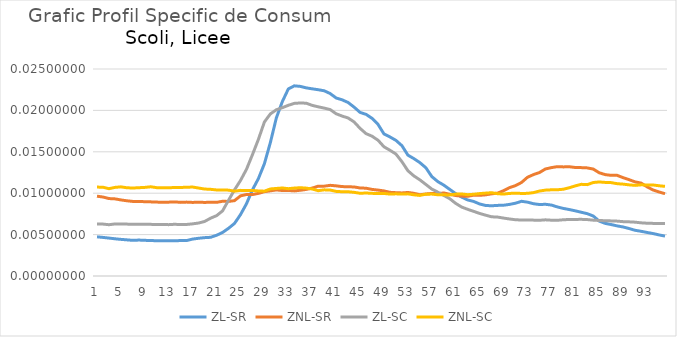
| Category | ZL-SR | ZNL-SR | ZL-SC | ZNL-SC |
|---|---|---|---|---|
| 0 | 0.005 | 0.01 | 0.006 | 0.011 |
| 1 | 0.005 | 0.01 | 0.006 | 0.011 |
| 2 | 0.005 | 0.009 | 0.006 | 0.011 |
| 3 | 0.004 | 0.009 | 0.006 | 0.011 |
| 4 | 0.004 | 0.009 | 0.006 | 0.011 |
| 5 | 0.004 | 0.009 | 0.006 | 0.011 |
| 6 | 0.004 | 0.009 | 0.006 | 0.011 |
| 7 | 0.004 | 0.009 | 0.006 | 0.011 |
| 8 | 0.004 | 0.009 | 0.006 | 0.011 |
| 9 | 0.004 | 0.009 | 0.006 | 0.011 |
| 10 | 0.004 | 0.009 | 0.006 | 0.011 |
| 11 | 0.004 | 0.009 | 0.006 | 0.011 |
| 12 | 0.004 | 0.009 | 0.006 | 0.011 |
| 13 | 0.004 | 0.009 | 0.006 | 0.011 |
| 14 | 0.004 | 0.009 | 0.006 | 0.011 |
| 15 | 0.004 | 0.009 | 0.006 | 0.011 |
| 16 | 0.004 | 0.009 | 0.006 | 0.011 |
| 17 | 0.005 | 0.009 | 0.006 | 0.011 |
| 18 | 0.005 | 0.009 | 0.007 | 0.011 |
| 19 | 0.005 | 0.009 | 0.007 | 0.01 |
| 20 | 0.005 | 0.009 | 0.007 | 0.01 |
| 21 | 0.005 | 0.009 | 0.008 | 0.01 |
| 22 | 0.006 | 0.009 | 0.009 | 0.01 |
| 23 | 0.006 | 0.009 | 0.01 | 0.01 |
| 24 | 0.007 | 0.01 | 0.012 | 0.01 |
| 25 | 0.009 | 0.01 | 0.013 | 0.01 |
| 26 | 0.01 | 0.01 | 0.015 | 0.01 |
| 27 | 0.012 | 0.01 | 0.017 | 0.01 |
| 28 | 0.014 | 0.01 | 0.019 | 0.01 |
| 29 | 0.016 | 0.01 | 0.02 | 0.011 |
| 30 | 0.019 | 0.01 | 0.02 | 0.011 |
| 31 | 0.021 | 0.01 | 0.02 | 0.011 |
| 32 | 0.023 | 0.01 | 0.021 | 0.011 |
| 33 | 0.023 | 0.01 | 0.021 | 0.011 |
| 34 | 0.023 | 0.01 | 0.021 | 0.011 |
| 35 | 0.023 | 0.01 | 0.021 | 0.011 |
| 36 | 0.023 | 0.011 | 0.021 | 0.011 |
| 37 | 0.022 | 0.011 | 0.02 | 0.01 |
| 38 | 0.022 | 0.011 | 0.02 | 0.01 |
| 39 | 0.022 | 0.011 | 0.02 | 0.01 |
| 40 | 0.021 | 0.011 | 0.02 | 0.01 |
| 41 | 0.021 | 0.011 | 0.019 | 0.01 |
| 42 | 0.021 | 0.011 | 0.019 | 0.01 |
| 43 | 0.02 | 0.011 | 0.019 | 0.01 |
| 44 | 0.02 | 0.011 | 0.018 | 0.01 |
| 45 | 0.02 | 0.011 | 0.017 | 0.01 |
| 46 | 0.019 | 0.01 | 0.017 | 0.01 |
| 47 | 0.018 | 0.01 | 0.016 | 0.01 |
| 48 | 0.017 | 0.01 | 0.016 | 0.01 |
| 49 | 0.017 | 0.01 | 0.015 | 0.01 |
| 50 | 0.016 | 0.01 | 0.015 | 0.01 |
| 51 | 0.016 | 0.01 | 0.014 | 0.01 |
| 52 | 0.015 | 0.01 | 0.013 | 0.01 |
| 53 | 0.014 | 0.01 | 0.012 | 0.01 |
| 54 | 0.014 | 0.01 | 0.012 | 0.01 |
| 55 | 0.013 | 0.01 | 0.011 | 0.01 |
| 56 | 0.012 | 0.01 | 0.01 | 0.01 |
| 57 | 0.011 | 0.01 | 0.01 | 0.01 |
| 58 | 0.011 | 0.01 | 0.01 | 0.01 |
| 59 | 0.01 | 0.01 | 0.009 | 0.01 |
| 60 | 0.01 | 0.01 | 0.009 | 0.01 |
| 61 | 0.01 | 0.01 | 0.008 | 0.01 |
| 62 | 0.009 | 0.01 | 0.008 | 0.01 |
| 63 | 0.009 | 0.01 | 0.008 | 0.01 |
| 64 | 0.009 | 0.01 | 0.008 | 0.01 |
| 65 | 0.009 | 0.01 | 0.007 | 0.01 |
| 66 | 0.008 | 0.01 | 0.007 | 0.01 |
| 67 | 0.009 | 0.01 | 0.007 | 0.01 |
| 68 | 0.009 | 0.01 | 0.007 | 0.01 |
| 69 | 0.009 | 0.011 | 0.007 | 0.01 |
| 70 | 0.009 | 0.011 | 0.007 | 0.01 |
| 71 | 0.009 | 0.011 | 0.007 | 0.01 |
| 72 | 0.009 | 0.012 | 0.007 | 0.01 |
| 73 | 0.009 | 0.012 | 0.007 | 0.01 |
| 74 | 0.009 | 0.012 | 0.007 | 0.01 |
| 75 | 0.009 | 0.013 | 0.007 | 0.01 |
| 76 | 0.009 | 0.013 | 0.007 | 0.01 |
| 77 | 0.008 | 0.013 | 0.007 | 0.01 |
| 78 | 0.008 | 0.013 | 0.007 | 0.01 |
| 79 | 0.008 | 0.013 | 0.007 | 0.011 |
| 80 | 0.008 | 0.013 | 0.007 | 0.011 |
| 81 | 0.008 | 0.013 | 0.007 | 0.011 |
| 82 | 0.008 | 0.013 | 0.007 | 0.011 |
| 83 | 0.007 | 0.013 | 0.007 | 0.011 |
| 84 | 0.007 | 0.012 | 0.007 | 0.011 |
| 85 | 0.006 | 0.012 | 0.007 | 0.011 |
| 86 | 0.006 | 0.012 | 0.007 | 0.011 |
| 87 | 0.006 | 0.012 | 0.007 | 0.011 |
| 88 | 0.006 | 0.012 | 0.007 | 0.011 |
| 89 | 0.006 | 0.012 | 0.007 | 0.011 |
| 90 | 0.006 | 0.011 | 0.007 | 0.011 |
| 91 | 0.005 | 0.011 | 0.006 | 0.011 |
| 92 | 0.005 | 0.011 | 0.006 | 0.011 |
| 93 | 0.005 | 0.01 | 0.006 | 0.011 |
| 94 | 0.005 | 0.01 | 0.006 | 0.011 |
| 95 | 0.005 | 0.01 | 0.006 | 0.011 |